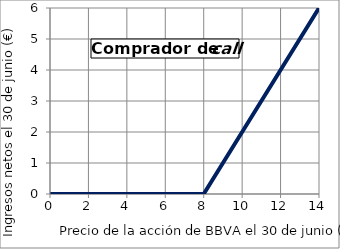
| Category | Comprador |
|---|---|
| 0.0 | 0 |
| 1.0 | 0 |
| 2.0 | 0 |
| 3.0 | 0 |
| 4.0 | 0 |
| 5.0 | 0 |
| 6.0 | 0 |
| 7.0 | 0 |
| 8.0 | 0 |
| 9.0 | 1 |
| 10.0 | 2 |
| 11.0 | 3 |
| 12.0 | 4 |
| 13.0 | 5 |
| 14.0 | 6 |